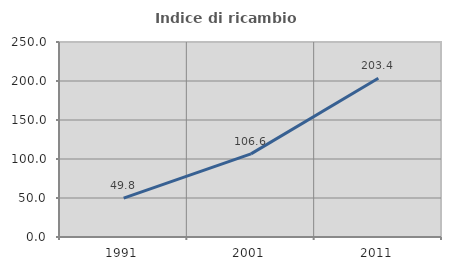
| Category | Indice di ricambio occupazionale  |
|---|---|
| 1991.0 | 49.838 |
| 2001.0 | 106.569 |
| 2011.0 | 203.431 |